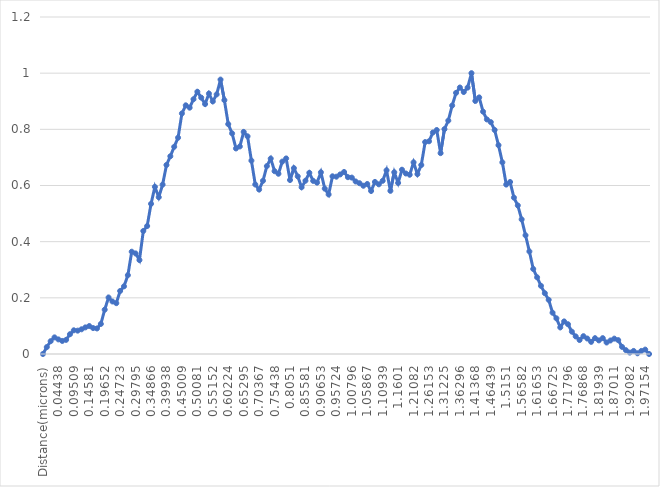
| Category | Series 0 |
|---|---|
| Distance(microns) | 0 |
| 0,00634 | 0.025 |
| 0,01902 | 0.046 |
| 0,0317 | 0.059 |
| 0,04438 | 0.052 |
| 0,05705 | 0.047 |
| 0,06973 | 0.05 |
| 0,08241 | 0.07 |
| 0,09509 | 0.084 |
| 0,10777 | 0.083 |
| 0,12045 | 0.088 |
| 0,13313 | 0.095 |
| 0,14581 | 0.1 |
| 0,15848 | 0.092 |
| 0,17116 | 0.091 |
| 0,18384 | 0.107 |
| 0,19652 | 0.158 |
| 0,2092 | 0.201 |
| 0,22188 | 0.187 |
| 0,23456 | 0.181 |
| 0,24723 | 0.224 |
| 0,25991 | 0.241 |
| 0,27259 | 0.281 |
| 0,28527 | 0.364 |
| 0,29795 | 0.358 |
| 0,31063 | 0.334 |
| 0,32331 | 0.438 |
| 0,33599 | 0.456 |
| 0,34866 | 0.535 |
| 0,36134 | 0.595 |
| 0,37402 | 0.558 |
| 0,3867 | 0.603 |
| 0,39938 | 0.673 |
| 0,41206 | 0.704 |
| 0,42474 | 0.738 |
| 0,43742 | 0.77 |
| 0,45009 | 0.857 |
| 0,46277 | 0.886 |
| 0,47545 | 0.877 |
| 0,48813 | 0.907 |
| 0,50081 | 0.934 |
| 0,51349 | 0.913 |
| 0,52617 | 0.89 |
| 0,53884 | 0.927 |
| 0,55152 | 0.899 |
| 0,5642 | 0.924 |
| 0,57688 | 0.977 |
| 0,58956 | 0.904 |
| 0,60224 | 0.819 |
| 0,61492 | 0.786 |
| 0,6276 | 0.732 |
| 0,64027 | 0.739 |
| 0,65295 | 0.791 |
| 0,66563 | 0.775 |
| 0,67831 | 0.689 |
| 0,69099 | 0.604 |
| 0,70367 | 0.585 |
| 0,71635 | 0.617 |
| 0,72903 | 0.669 |
| 0,7417 | 0.696 |
| 0,75438 | 0.651 |
| 0,76706 | 0.642 |
| 0,77974 | 0.685 |
| 0,79242 | 0.696 |
| 0,8051 | 0.62 |
| 0,81778 | 0.662 |
| 0,83045 | 0.633 |
| 0,84313 | 0.594 |
| 0,85581 | 0.617 |
| 0,86849 | 0.645 |
| 0,88117 | 0.616 |
| 0,89385 | 0.61 |
| 0,90653 | 0.647 |
| 0,91921 | 0.589 |
| 0,93188 | 0.568 |
| 0,94456 | 0.633 |
| 0,95724 | 0.631 |
| 0,96992 | 0.639 |
| 0,9826 | 0.648 |
| 0,99528 | 0.63 |
| 1,00796 | 0.628 |
| 1,02064 | 0.614 |
| 1,03331 | 0.608 |
| 1,04599 | 0.599 |
| 1,05867 | 0.605 |
| 1,07135 | 0.581 |
| 1,08403 | 0.613 |
| 1,09671 | 0.604 |
| 1,10939 | 0.617 |
| 1,12207 | 0.654 |
| 1,13474 | 0.581 |
| 1,14742 | 0.647 |
| 1,1601 | 0.609 |
| 1,17278 | 0.656 |
| 1,18546 | 0.643 |
| 1,19814 | 0.638 |
| 1,21082 | 0.682 |
| 1,22349 | 0.641 |
| 1,23617 | 0.673 |
| 1,24885 | 0.755 |
| 1,26153 | 0.757 |
| 1,27421 | 0.789 |
| 1,28689 | 0.797 |
| 1,29957 | 0.715 |
| 1,31225 | 0.801 |
| 1,32492 | 0.831 |
| 1,3376 | 0.885 |
| 1,35028 | 0.93 |
| 1,36296 | 0.949 |
| 1,37564 | 0.933 |
| 1,38832 | 0.949 |
| 1,401 | 1 |
| 1,41368 | 0.901 |
| 1,42635 | 0.914 |
| 1,43903 | 0.863 |
| 1,45171 | 0.835 |
| 1,46439 | 0.826 |
| 1,47707 | 0.798 |
| 1,48975 | 0.743 |
| 1,50243 | 0.682 |
| 1,5151 | 0.603 |
| 1,52778 | 0.612 |
| 1,54046 | 0.557 |
| 1,55314 | 0.529 |
| 1,56582 | 0.479 |
| 1,5785 | 0.423 |
| 1,59118 | 0.365 |
| 1,60386 | 0.303 |
| 1,61653 | 0.273 |
| 1,62921 | 0.243 |
| 1,64189 | 0.217 |
| 1,65457 | 0.193 |
| 1,66725 | 0.147 |
| 1,67993 | 0.127 |
| 1,69261 | 0.095 |
| 1,70529 | 0.116 |
| 1,71796 | 0.106 |
| 1,73064 | 0.08 |
| 1,74332 | 0.063 |
| 1,756 | 0.05 |
| 1,76868 | 0.063 |
| 1,78136 | 0.055 |
| 1,79404 | 0.043 |
| 1,80671 | 0.056 |
| 1,81939 | 0.048 |
| 1,83207 | 0.057 |
| 1,84475 | 0.041 |
| 1,85743 | 0.048 |
| 1,87011 | 0.055 |
| 1,88279 | 0.049 |
| 1,89547 | 0.025 |
| 1,90814 | 0.014 |
| 1,92082 | 0.005 |
| 1,9335 | 0.011 |
| 1,94618 | 0.003 |
| 1,95886 | 0.011 |
| 1,97154 | 0.016 |
| 1,98422 | 0 |